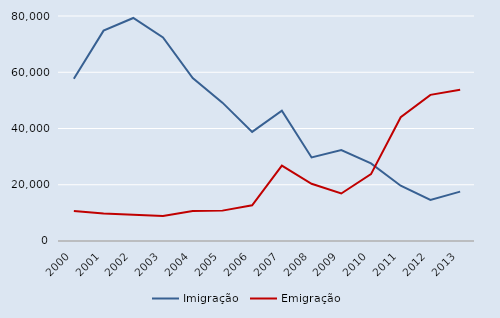
| Category | Imigração | Emigração |
|---|---|---|
| 2000.0 | 57660 | 10660 |
| 2001.0 | 74800 | 9800 |
| 2002.0 | 79300 | 9300 |
| 2003.0 | 72400 | 8900 |
| 2004.0 | 57920 | 10680 |
| 2005.0 | 49200 | 10800 |
| 2006.0 | 38800 | 12700 |
| 2007.0 | 46300 | 26800 |
| 2008.0 | 29718 | 20357 |
| 2009.0 | 32307 | 16899 |
| 2010.0 | 27575 | 23760 |
| 2011.0 | 19667 | 43998 |
| 2012.0 | 14606 | 51958 |
| 2013.0 | 17554 | 53786 |